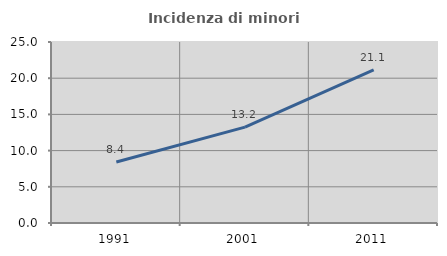
| Category | Incidenza di minori stranieri |
|---|---|
| 1991.0 | 8.423 |
| 2001.0 | 13.238 |
| 2011.0 | 21.14 |